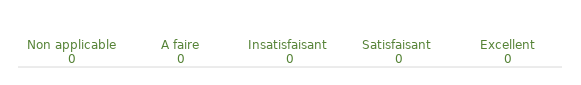
| Category | Choix Indicateurs |
|---|---|
| Non applicable | 0 |
| A faire | 0 |
| Insatisfaisant  | 0 |
| Satisfaisant  | 0 |
| Excellent | 0 |